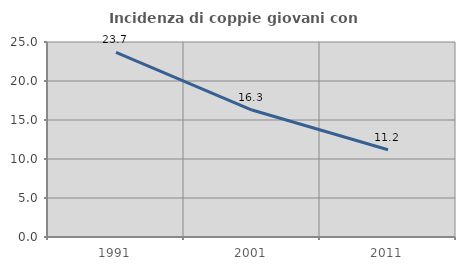
| Category | Incidenza di coppie giovani con figli |
|---|---|
| 1991.0 | 23.664 |
| 2001.0 | 16.279 |
| 2011.0 | 11.19 |